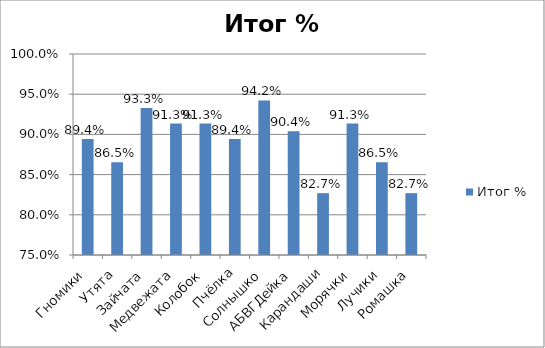
| Category | Итог % |
|---|---|
| Гномики | 0.894 |
| Утята | 0.865 |
| Зайчата | 0.933 |
| Медвежата | 0.913 |
| Колобок | 0.913 |
| Пчёлка | 0.894 |
| Солнышко | 0.942 |
| АБВГДейка | 0.904 |
| Карандаши | 0.827 |
| Морячки | 0.913 |
| Лучики | 0.865 |
| Ромашка | 0.827 |